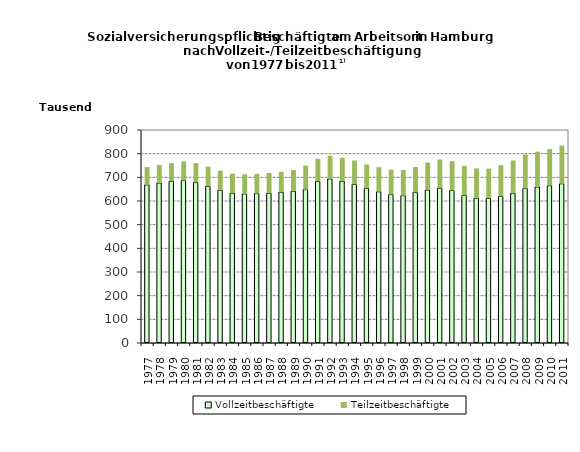
| Category | Vollzeitbeschäftigte | Teilzeitbeschäftigte |
|---|---|---|
| 1977.0 | 668123 | 75130 |
| 1978.0 | 676109 | 75959 |
| 1979.0 | 683705 | 76241 |
| 1980.0 | 686203 | 81164 |
| 1981.0 | 678057 | 82065 |
| 1982.0 | 661681 | 83383 |
| 1983.0 | 645847 | 82518 |
| 1984.0 | 633235 | 82282 |
| 1985.0 | 630081 | 82876 |
| 1986.0 | 631283 | 83594 |
| 1987.0 | 632985 | 85693 |
| 1988.0 | 636702 | 86798 |
| 1989.0 | 641681 | 89409 |
| 1990.0 | 647941 | 101424 |
| 1991.0 | 683094 | 95399 |
| 1992.0 | 693547 | 97804 |
| 1993.0 | 683689 | 99325 |
| 1994.0 | 670272 | 100836 |
| 1995.0 | 653998 | 100499 |
| 1996.0 | 638965 | 103857 |
| 1997.0 | 627192 | 105130 |
| 1998.0 | 622409 | 108954 |
| 1999.0 | 635915 | 107838 |
| 2000.0 | 646215 | 116256 |
| 2001.0 | 652961 | 121908 |
| 2002.0 | 644260 | 124427 |
| 2003.0 | 623539 | 125008 |
| 2004.0 | 612277 | 125285 |
| 2005.0 | 610795 | 125982 |
| 2006.0 | 619667 | 131459 |
| 2007.0 | 633311 | 137751 |
| 2008.0 | 652533 | 144061 |
| 2009.0 | 659237 | 149283 |
| 2010.0 | 664956 | 154370 |
| 2011.0 | 672796 | 161285 |